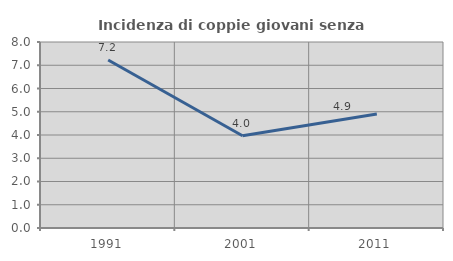
| Category | Incidenza di coppie giovani senza figli |
|---|---|
| 1991.0 | 7.225 |
| 2001.0 | 3.966 |
| 2011.0 | 4.905 |